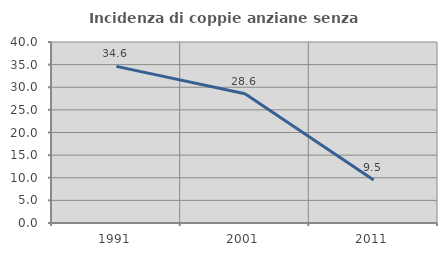
| Category | Incidenza di coppie anziane senza figli  |
|---|---|
| 1991.0 | 34.615 |
| 2001.0 | 28.571 |
| 2011.0 | 9.524 |